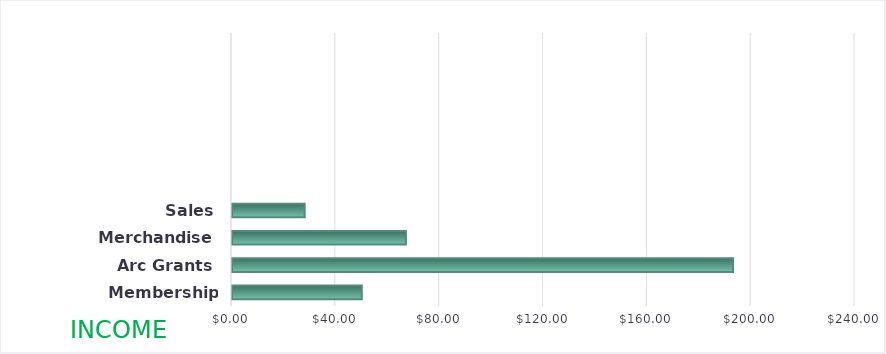
| Category | Amount |
|---|---|
| Membership Fees | 50 |
| Arc Grants | 193 |
| Merchandise | 67 |
| Sales | 28 |